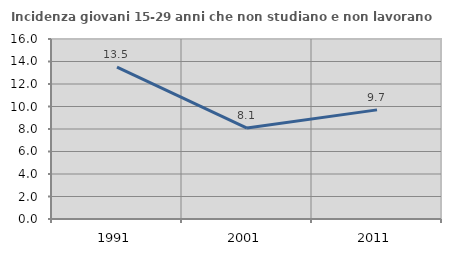
| Category | Incidenza giovani 15-29 anni che non studiano e non lavorano  |
|---|---|
| 1991.0 | 13.508 |
| 2001.0 | 8.086 |
| 2011.0 | 9.7 |